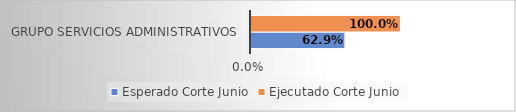
| Category | Esperado Corte Junio | Ejecutado Corte Junio |
|---|---|---|
| Grupo Servicios Administrativos | 0.629 | 1 |